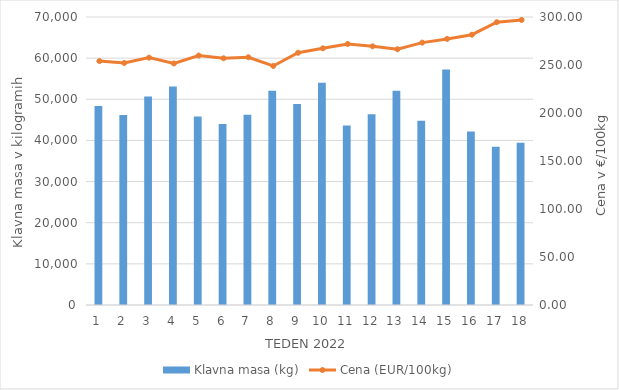
| Category | Klavna masa (kg) |
|---|---|
| 1.0 | 48349 |
| 2.0 | 46187 |
| 3.0 | 50692 |
| 4.0 | 53081 |
| 5.0 | 45844 |
| 6.0 | 43982 |
| 7.0 | 46227 |
| 8.0 | 52099 |
| 9.0 | 48872 |
| 10.0 | 54045 |
| 11.0 | 43645 |
| 12.0 | 46350 |
| 13.0 | 52061 |
| 14.0 | 44774 |
| 15.0 | 57268 |
| 16.0 | 42191 |
| 17.0 | 38469 |
| 18.0 | 39417 |